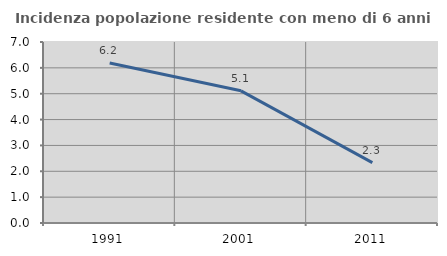
| Category | Incidenza popolazione residente con meno di 6 anni |
|---|---|
| 1991.0 | 6.186 |
| 2001.0 | 5.111 |
| 2011.0 | 2.337 |